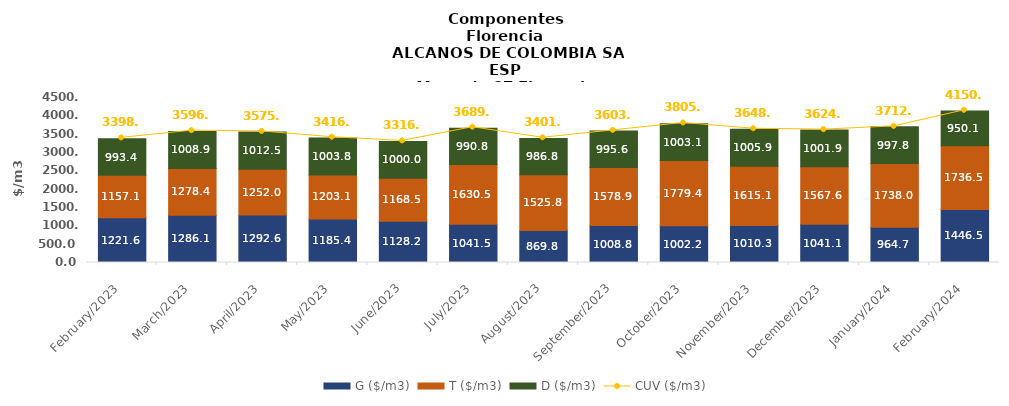
| Category | G ($/m3) | T ($/m3) | D ($/m3) |
|---|---|---|---|
| 2023-02-01 | 1221.59 | 1157.08 | 993.4 |
| 2023-03-01 | 1286.09 | 1278.38 | 1008.86 |
| 2023-04-01 | 1292.6 | 1251.95 | 1012.48 |
| 2023-05-01 | 1185.42 | 1203.07 | 1003.78 |
| 2023-06-01 | 1128.21 | 1168.47 | 999.96 |
| 2023-07-01 | 1041.54 | 1630.51 | 990.77 |
| 2023-08-01 | 869.82 | 1525.81 | 986.78 |
| 2023-09-01 | 1008.82 | 1578.87 | 995.55 |
| 2023-10-01 | 1002.24 | 1779.41 | 1003.05 |
| 2023-11-01 | 1010.34 | 1615.11 | 1005.88 |
| 2023-12-01 | 1041.14 | 1567.6 | 1001.9 |
| 2024-01-01 | 964.66 | 1738.01 | 997.84 |
| 2024-02-01 | 1446.48 | 1736.48 | 950.05 |